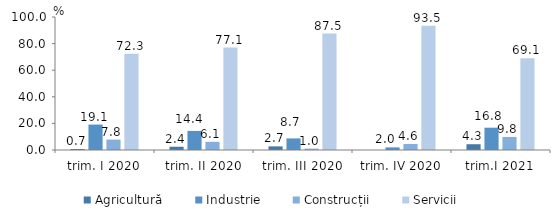
| Category | Agricultură | Industrie | Construcții | Servicii |
|---|---|---|---|---|
| trim. I 2020 | 0.749 | 19.118 | 7.82 | 72.313 |
| trim. II 2020 | 2.443 | 14.357 | 6.144 | 77.056 |
| trim. III 2020 | 2.728 | 8.699 | 1.036 | 87.537 |
| trim. IV 2020 | 0 | 1.98 | 4.553 | 93.467 |
| trim.I 2021 | 4.343 | 16.772 | 9.821 | 69.063 |